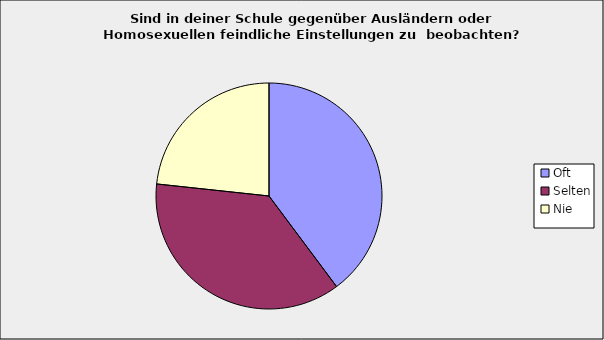
| Category | Series 0 |
|---|---|
| Oft | 0.398 |
| Selten | 0.369 |
| Nie | 0.233 |